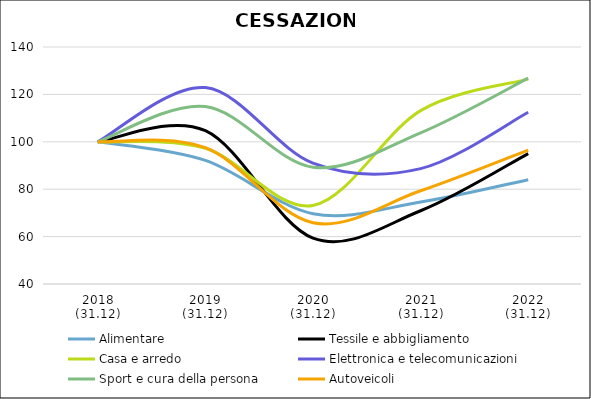
| Category | Alimentare | Tessile e abbigliamento | Casa e arredo | Elettronica e telecomunicazioni | Sport e cura della persona | Autoveicoli |
|---|---|---|---|---|---|---|
| 2018
(31.12) | 100 | 100 | 100 | 100 | 100 | 100 |
| 2019
(31.12) | 92.138 | 104.668 | 97.262 | 122.864 | 114.852 | 97.504 |
| 2020
(31.12) | 69.668 | 59.361 | 73.142 | 90.993 | 89.283 | 65.835 |
| 2021
(31.12) | 74.582 | 70.909 | 113.168 | 88.684 | 103.797 | 79.329 |
| 2022
(31.12) | 83.984 | 95.037 | 126.467 | 112.471 | 126.835 | 96.49 |